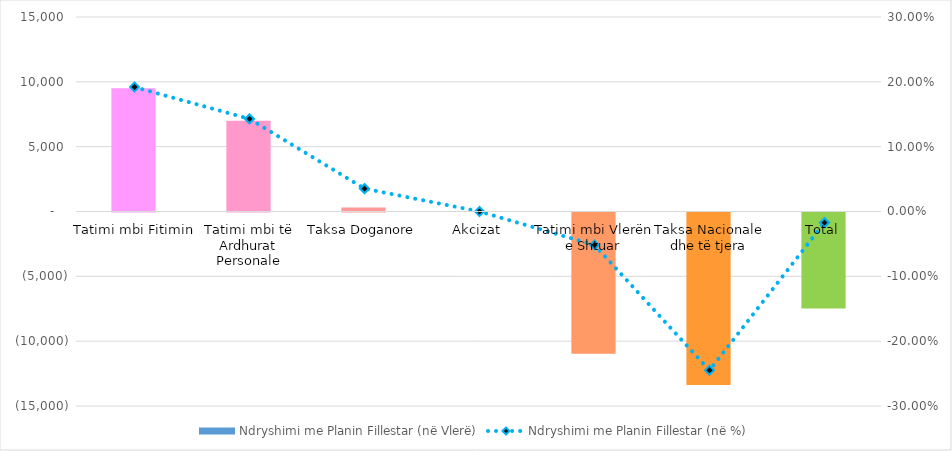
| Category | Ndryshimi me Planin Fillestar (në Vlerë) |
|---|---|
| Tatimi mbi Fitimin | 9500 |
| Tatimi mbi të Ardhurat Personale | 7000 |
| Taksa Doganore | 300 |
| Akcizat | 0 |
| Tatimi mbi Vlerën e Shtuar | -10900 |
| Taksa Nacionale dhe të tjera | -13300 |
| Total | -7400 |